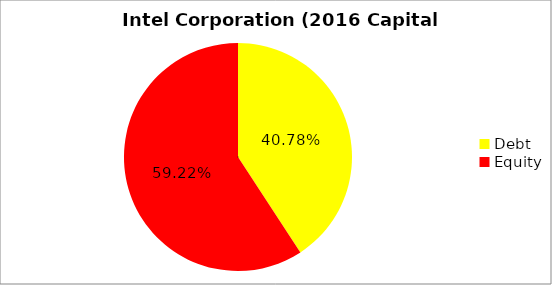
| Category | Series 0 |
|---|---|
| Debt | 0.408 |
| Equity | 0.592 |